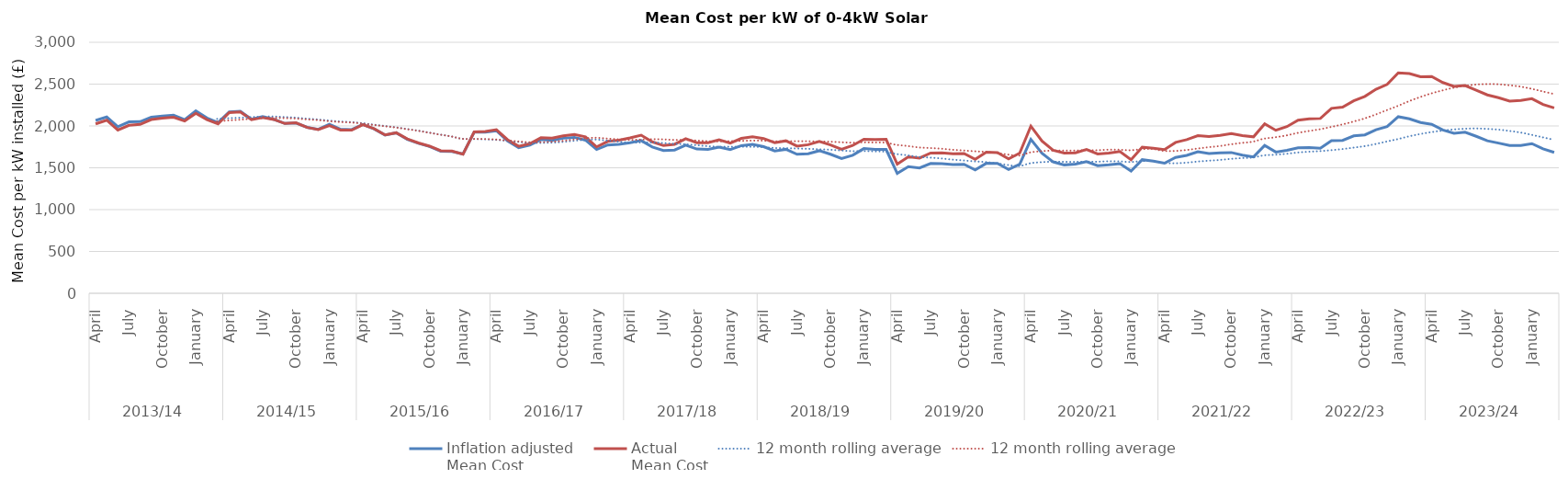
| Category | Inflation adjusted
Mean Cost | Actual
Mean Cost |
|---|---|---|
| 0 | 2066.37 | 2025.04 |
| 1 | 2106.93 | 2069.01 |
| 2 | 1991 | 1951.18 |
| 3 | 2048.3 | 2007.33 |
| 4 | 2051.16 | 2018.34 |
| 5 | 2103.42 | 2076.08 |
| 6 | 2118.84 | 2093.41 |
| 7 | 2129.51 | 2103.96 |
| 8 | 2076.17 | 2059.56 |
| 9 | 2180.39 | 2152.04 |
| 10 | 2094.88 | 2076.03 |
| 11 | 2039.63 | 2025.35 |
| 12 | 2168.53 | 2159.86 |
| 13 | 2176.17 | 2167.47 |
| 14 | 2080 | 2075.84 |
| 15 | 2110.89 | 2102.45 |
| 16 | 2079.85 | 2077.77 |
| 17 | 2029.64 | 2029.64 |
| 18 | 2035.75 | 2037.79 |
| 19 | 1984.05 | 1982.07 |
| 20 | 1959.15 | 1957.19 |
| 21 | 2019.73 | 2003.57 |
| 22 | 1961.11 | 1951.3 |
| 23 | 1957.36 | 1949.53 |
| 24 | 2016.96 | 2014.94 |
| 25 | 1965.77 | 1967.74 |
| 26 | 1891.48 | 1893.37 |
| 27 | 1918.33 | 1918.33 |
| 28 | 1838.99 | 1844.51 |
| 29 | 1793.08 | 1796.67 |
| 30 | 1753.61 | 1758.87 |
| 31 | 1698.2 | 1703.29 |
| 32 | 1694.3 | 1701.08 |
| 33 | 1664.45 | 1662.79 |
| 34 | 1925.79 | 1927.72 |
| 35 | 1926.11 | 1933.81 |
| 36 | 1942.9 | 1954.56 |
| 37 | 1820.82 | 1835.39 |
| 38 | 1739.86 | 1757.26 |
| 39 | 1771.91 | 1787.86 |
| 40 | 1837.15 | 1859.2 |
| 41 | 1826.32 | 1853.71 |
| 42 | 1853.02 | 1882.67 |
| 43 | 1863.63 | 1897.18 |
| 44 | 1830.12 | 1870.38 |
| 45 | 1718.43 | 1749.36 |
| 46 | 1772.83 | 1815.38 |
| 47 | 1780.78 | 1828.86 |
| 48 | 1798.91 | 1856.47 |
| 49 | 1825.88 | 1889.79 |
| 50 | 1749.12 | 1810.34 |
| 51 | 1705.99 | 1765.7 |
| 52 | 1712.64 | 1781.15 |
| 53 | 1770.92 | 1847.07 |
| 54 | 1724.8 | 1800.69 |
| 55 | 1719.3 | 1800.11 |
| 56 | 1746.91 | 1834.26 |
| 57 | 1717.39 | 1794.67 |
| 58 | 1764.93 | 1851.41 |
| 59 | 1779.04 | 1869.77 |
| 60 | 1752.88 | 1849.29 |
| 61 | 1700.46 | 1800.79 |
| 62 | 1720.75 | 1822.27 |
| 63 | 1661.66 | 1759.7 |
| 64 | 1667.52 | 1775.91 |
| 65 | 1703.99 | 1816.45 |
| 66 | 1662.16 | 1773.53 |
| 67 | 1609.82 | 1720.9 |
| 68 | 1649.83 | 1766.97 |
| 69 | 1729.78 | 1840.49 |
| 70 | 1719.81 | 1836.76 |
| 71 | 1718.87 | 1839.19 |
| 72 | 1433.91 | 1542.89 |
| 73 | 1513 | 1632.53 |
| 74 | 1498.38 | 1616.75 |
| 75 | 1552.05 | 1676.21 |
| 76 | 1550.2 | 1678.87 |
| 77 | 1539.34 | 1668.64 |
| 78 | 1542.05 | 1670.04 |
| 79 | 1475 | 1600.37 |
| 80 | 1553.91 | 1685.99 |
| 81 | 1553.57 | 1682.52 |
| 82 | 1480.09 | 1607.38 |
| 83 | 1543.03 | 1675.73 |
| 84 | 1839.64 | 1997.85 |
| 85 | 1674.8 | 1818.83 |
| 86 | 1570.74 | 1708.96 |
| 87 | 1534.47 | 1675.64 |
| 88 | 1543.91 | 1679.77 |
| 89 | 1573.9 | 1718.7 |
| 90 | 1525.61 | 1665.97 |
| 91 | 1535.09 | 1674.78 |
| 92 | 1548.24 | 1693.78 |
| 93 | 1460.3 | 1596.11 |
| 94 | 1596.66 | 1746.75 |
| 95 | 1579.31 | 1732.5 |
| 96 | 1555.05 | 1716.78 |
| 97 | 1624.47 | 1803.16 |
| 98 | 1648.9 | 1836.88 |
| 99 | 1691.44 | 1884.26 |
| 100 | 1671.4 | 1873.64 |
| 101 | 1679.41 | 1887.66 |
| 102 | 1682.47 | 1907.92 |
| 103 | 1650.99 | 1883.78 |
| 104 | 1630.64 | 1870.05 |
| 105 | 1767.19 | 2025.2 |
| 106 | 1688.35 | 1948.36 |
| 107 | 1709.79 | 1991.9 |
| 108 | 1738.17 | 2068.42 |
| 109 | 1742.48 | 2085.75 |
| 110 | 1733.79 | 2089.22 |
| 111 | 1824.04 | 2210.74 |
| 112 | 1827.52 | 2225.92 |
| 113 | 1881.36 | 2300.9 |
| 114 | 1893.64 | 2353.79 |
| 115 | 1954.5 | 2439.22 |
| 116 | 1992.93 | 2497.14 |
| 117 | 2110.62 | 2634.05 |
| 118 | 2084.41 | 2626.36 |
| 119 | 2041.33 | 2588.41 |
| 120 | 2019.72 | 2591.3 |
| 121 | 1951.28 | 2519.1 |
| 122 | 1911.56 | 2473.56 |
| 123 | 1924.72 | 2482.89 |
| 124 | 1876.14 | 2427.72 |
| 125 | 1822.61 | 2371.21 |
| 126 | 1795.18 | 2337.33 |
| 127 | 1766.68 | 2296.69 |
| 128 | 1766.87 | 2305.77 |
| 129 | 1788.94 | 2325.62 |
| 130 | 1725.73 | 2257.26 |
| 131 | 1683.89 | 2216 |